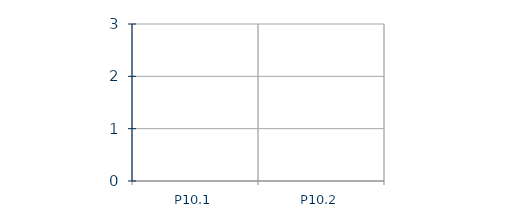
| Category | Series 0 |
|---|---|
| P10.1 | 0 |
| P10.2 | 0 |